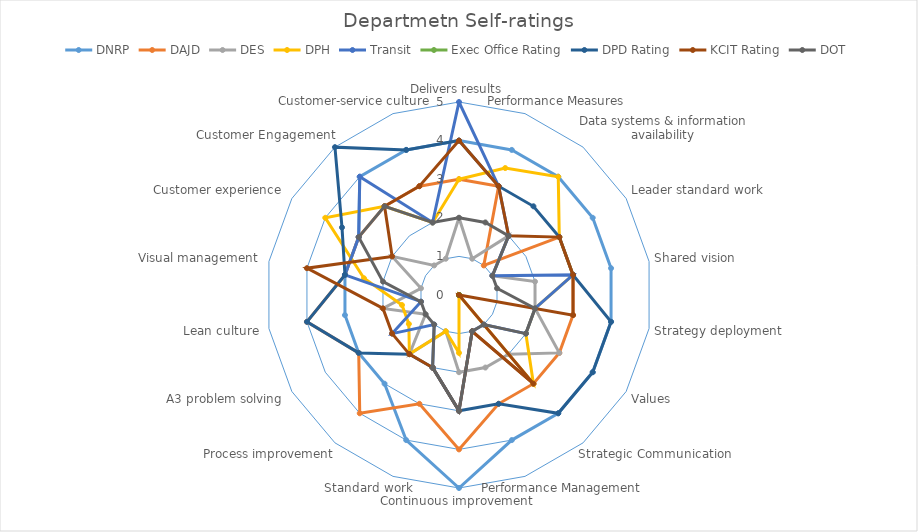
| Category | DNRP | DAJD | DES | DPH | Transit | Exec Office Rating | DPD Rating | KCIT Rating | DOT |
|---|---|---|---|---|---|---|---|---|---|
| Delivers results | 4 | 3 | 2 | 3 | 5 | 0 | 4 | 4 | 2 |
| Performance Measures | 4 | 3 | 1 | 3.5 | 3 | 0 | 3 | 3 | 2 |
| Data systems & information availability | 4 | 1 | 2 | 4 | 2 | 0 | 3 | 2 | 2 |
| Leader standard work | 4 | 3 | 1 | 3 | 1 | 0 | 3 | 3 | 1 |
| Shared vision | 4 | 3 | 2 | 3 | 3 | 0 | 3 | 3 | 1 |
| Strategy deployment | 4 | 3 | 2 | 2 | 2 | 0 | 4 | 3 | 2 |
| Values | 4 | 3 | 3 | 2 | 2 | 0 | 4 | 0 | 2 |
| Strategic Communication | 4 | 3 | 2 | 3 | 1 | 0 | 4 | 3 | 1 |
| Performance Management | 4 | 3 | 2 | 0 | 1 | 0 | 3 | 1 | 1 |
| Continuous improvement | 5 | 4 | 2 | 1.5 | 3 | 0 | 3 | 3 | 3 |
| Standard work | 4 | 3 | 1 | 1 | 2 | 0 | 2 | 2 | 2 |
| Process improvement | 3 | 4 | 2 | 2 | 1 | 0 | 2 | 2 | 1 |
| A3 problem solving | 3 | 3 | 1 | 1.5 | 2 | 0 | 3 | 2 | 1 |
| Lean culture | 3 | 4 | 2 | 1.5 | 1 | 0 | 4 | 2 | 1 |
| Visual management | 3 | 3 | 1 | 2.5 | 3 | 0 | 3 | 4 | 2 |
| Customer experience | 3 | 3 | 2 | 4 | 3 | 0 | 3.5 | 2 | 3 |
| Customer Engagement | 4 | 3 | 1 | 3 | 4 | 0 | 5 | 3 | 3 |
| Customer-service culture | 4 | 3 | 1 | 2 | 2 | 0 | 4 | 3 | 2 |